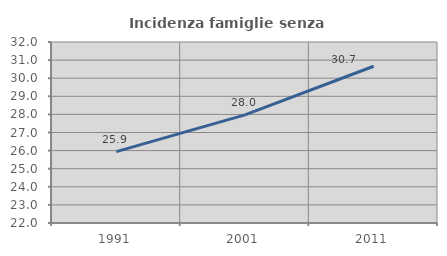
| Category | Incidenza famiglie senza nuclei |
|---|---|
| 1991.0 | 25.943 |
| 2001.0 | 27.972 |
| 2011.0 | 30.66 |